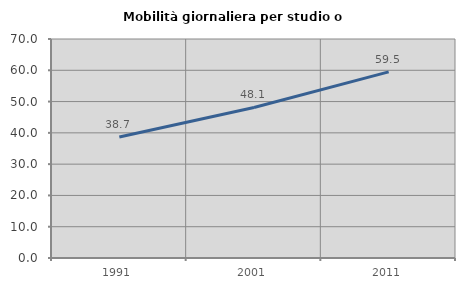
| Category | Mobilità giornaliera per studio o lavoro |
|---|---|
| 1991.0 | 38.651 |
| 2001.0 | 48.12 |
| 2011.0 | 59.499 |